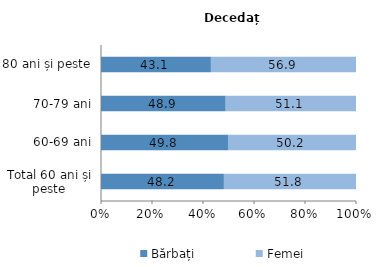
| Category | Bărbați | Femei |
|---|---|---|
| Total 60 ani și peste | 48.2 | 51.8 |
| 60-69 ani | 49.8 | 50.2 |
| 70-79 ani | 48.9 | 51.1 |
| 80 ani și peste | 43.1 | 56.9 |